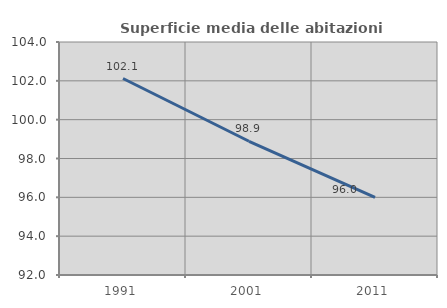
| Category | Superficie media delle abitazioni occupate |
|---|---|
| 1991.0 | 102.119 |
| 2001.0 | 98.887 |
| 2011.0 | 96.003 |